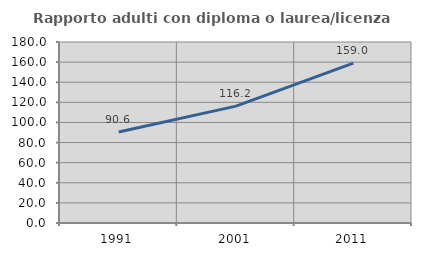
| Category | Rapporto adulti con diploma o laurea/licenza media  |
|---|---|
| 1991.0 | 90.56 |
| 2001.0 | 116.222 |
| 2011.0 | 158.976 |